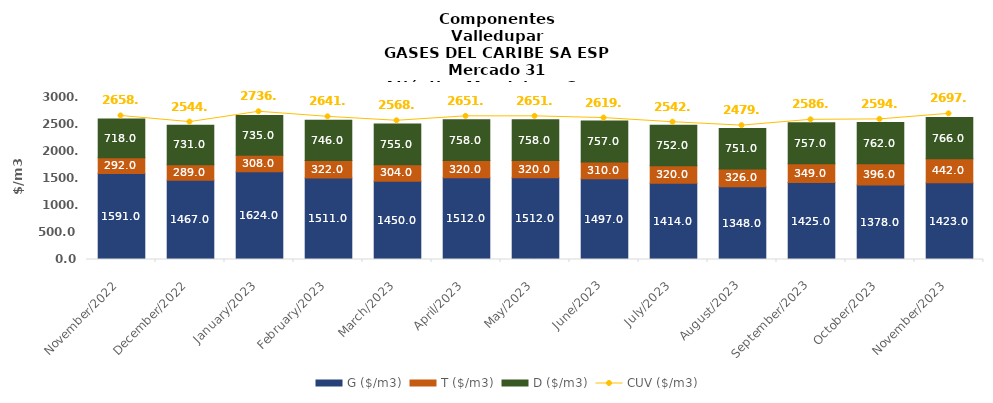
| Category | G ($/m3) | T ($/m3) | D ($/m3) |
|---|---|---|---|
| 2022-11-01 | 1591 | 292 | 718 |
| 2022-12-01 | 1467 | 289 | 731 |
| 2023-01-01 | 1624 | 308 | 735 |
| 2023-02-01 | 1511 | 322 | 746 |
| 2023-03-01 | 1450 | 304 | 755 |
| 2023-04-01 | 1512 | 320 | 758 |
| 2023-05-01 | 1512 | 320 | 758 |
| 2023-06-01 | 1497 | 310 | 757 |
| 2023-07-01 | 1414 | 320 | 752 |
| 2023-08-01 | 1348 | 326 | 751 |
| 2023-09-01 | 1425 | 349 | 757 |
| 2023-10-01 | 1378 | 396 | 762 |
| 2023-11-01 | 1423 | 442 | 766 |